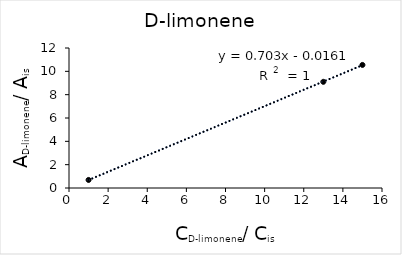
| Category | Series 0 |
|---|---|
| 1.0 | 0.69 |
| 13.0 | 9.101 |
| 15.0 | 10.548 |